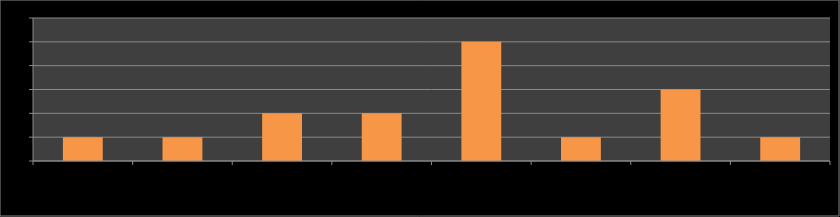
| Category | Series 0 |
|---|---|
| Ярошко М. | 1 |
| Гузовець І. | 1 |
| Пігаль В. | 2 |
| Пігаль С. | 2 |
| Гречко Т. | 5 |
| Лозицький І. | 1 |
| Тарасюк П. | 3 |
| Олексієвець О. | 1 |